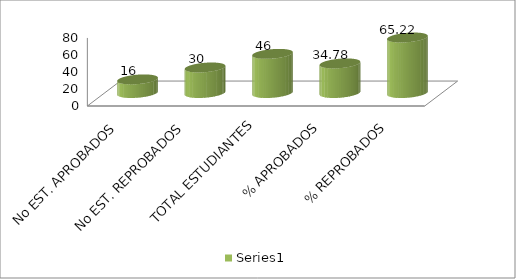
| Category | Series 0 |
|---|---|
| No EST. APROBADOS | 16 |
| No EST. REPROBADOS | 30 |
| TOTAL ESTUDIANTES | 46 |
| % APROBADOS | 34.783 |
| % REPROBADOS | 65.217 |